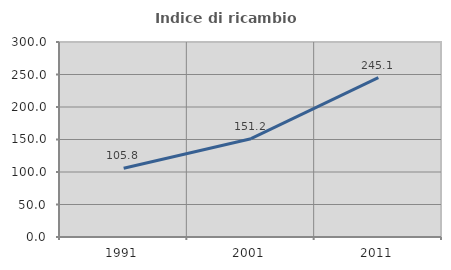
| Category | Indice di ricambio occupazionale  |
|---|---|
| 1991.0 | 105.844 |
| 2001.0 | 151.22 |
| 2011.0 | 245.098 |